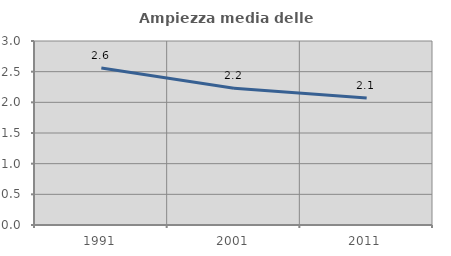
| Category | Ampiezza media delle famiglie |
|---|---|
| 1991.0 | 2.56 |
| 2001.0 | 2.229 |
| 2011.0 | 2.07 |